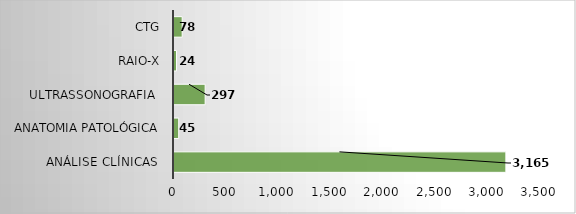
| Category | Series 0 |
|---|---|
| Análise Clínicas  | 3165 |
| Anatomia Patológica | 45 |
| Ultrassonografia  | 297 |
| RAIO-X | 24 |
| CTG | 78 |